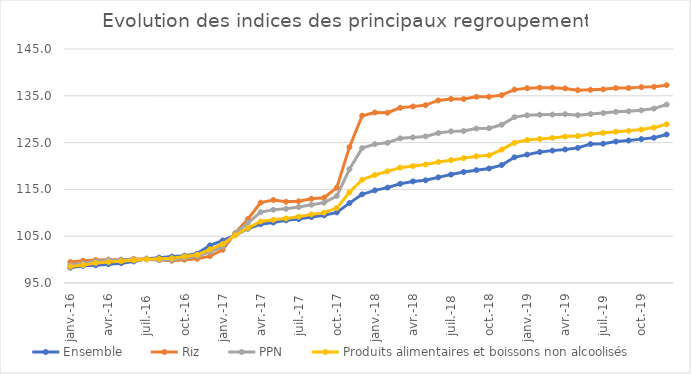
| Category | Ensemble | Riz | PPN | Produits alimentaires et boissons non alcoolisés |
|---|---|---|---|---|
| 2016-01-01 | 98.275 | 99.495 | 98.861 | 98.497 |
| 2016-02-01 | 98.669 | 99.754 | 99.183 | 98.836 |
| 2016-03-01 | 98.78 | 99.934 | 99.647 | 99.278 |
| 2016-04-01 | 99.017 | 99.994 | 99.867 | 99.476 |
| 2016-05-01 | 99.242 | 99.991 | 99.897 | 99.634 |
| 2016-06-01 | 99.614 | 100.144 | 100.021 | 99.851 |
| 2016-07-01 | 100.2 | 100.14 | 100.04 | 100.066 |
| 2016-08-01 | 100.412 | 99.904 | 99.904 | 100.159 |
| 2016-09-01 | 100.639 | 99.746 | 99.918 | 100.312 |
| 2016-10-01 | 100.848 | 99.979 | 100.318 | 100.675 |
| 2016-11-01 | 101.278 | 100.17 | 100.701 | 101.025 |
| 2016-12-01 | 103.026 | 100.747 | 101.643 | 102.191 |
| 2017-01-01 | 104.075 | 102.088 | 102.766 | 103.319 |
| 2017-02-01 | 105.227 | 105.671 | 105.604 | 105.201 |
| 2017-03-01 | 106.597 | 108.676 | 107.857 | 106.739 |
| 2017-04-01 | 107.562 | 112.176 | 110.14 | 108.143 |
| 2017-05-01 | 107.914 | 112.738 | 110.659 | 108.491 |
| 2017-06-01 | 108.397 | 112.351 | 110.843 | 108.798 |
| 2017-07-01 | 108.659 | 112.464 | 111.234 | 109.178 |
| 2017-08-01 | 109.085 | 113.002 | 111.719 | 109.659 |
| 2017-09-01 | 109.466 | 113.231 | 112.163 | 110.039 |
| 2017-10-01 | 110.085 | 115.374 | 113.583 | 111.008 |
| 2017-11-01 | 112.067 | 124.042 | 119.334 | 114.381 |
| 2017-12-01 | 113.945 | 130.752 | 123.824 | 117.072 |
| 2018-01-01 | 114.792 | 131.429 | 124.677 | 118.083 |
| 2018-02-01 | 115.382 | 131.39 | 124.962 | 118.86 |
| 2018-03-01 | 116.197 | 132.45 | 125.908 | 119.648 |
| 2018-04-01 | 116.708 | 132.716 | 126.112 | 119.992 |
| 2018-05-01 | 116.945 | 133.005 | 126.317 | 120.318 |
| 2018-06-01 | 117.574 | 134.006 | 127.039 | 120.852 |
| 2018-07-01 | 118.169 | 134.333 | 127.399 | 121.251 |
| 2018-08-01 | 118.716 | 134.315 | 127.482 | 121.67 |
| 2018-09-01 | 119.112 | 134.797 | 128.002 | 122.064 |
| 2018-10-01 | 119.471 | 134.79 | 128.09 | 122.277 |
| 2018-11-01 | 120.196 | 135.136 | 128.817 | 123.5 |
| 2018-12-01 | 121.856 | 136.326 | 130.448 | 124.972 |
| 2019-01-01 | 122.431 | 136.617 | 130.824 | 125.539 |
| 2019-02-01 | 122.976 | 136.743 | 130.947 | 125.775 |
| 2019-03-01 | 123.287 | 136.724 | 130.988 | 126.003 |
| 2019-04-01 | 123.539 | 136.57 | 131.08 | 126.288 |
| 2019-05-01 | 123.87 | 136.199 | 130.864 | 126.405 |
| 2019-06-01 | 124.678 | 136.285 | 131.1 | 126.791 |
| 2019-07-01 | 124.773 | 136.384 | 131.306 | 127.081 |
| 2019-08-01 | 125.224 | 136.653 | 131.568 | 127.335 |
| 2019-09-01 | 125.442 | 136.653 | 131.684 | 127.515 |
| 2019-10-01 | 125.743 | 136.854 | 131.892 | 127.783 |
| 2019-11-01 | 126.03 | 136.915 | 132.269 | 128.209 |
| 2019-12-01 | 126.732 | 137.262 | 133.132 | 128.908 |